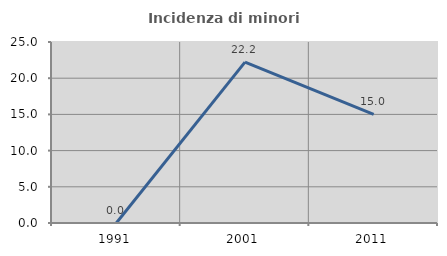
| Category | Incidenza di minori stranieri |
|---|---|
| 1991.0 | 0 |
| 2001.0 | 22.222 |
| 2011.0 | 15 |